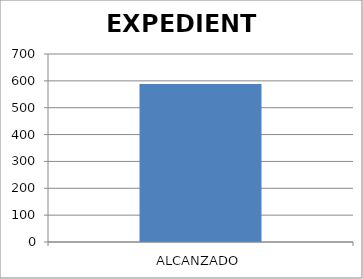
| Category | EXPEDIENTE |
|---|---|
| ALCANZADO | 588 |